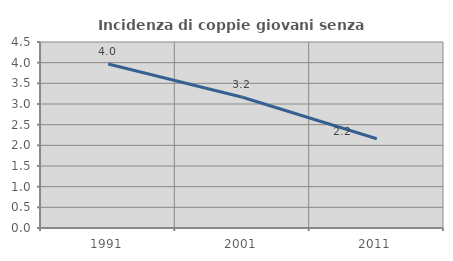
| Category | Incidenza di coppie giovani senza figli |
|---|---|
| 1991.0 | 3.967 |
| 2001.0 | 3.165 |
| 2011.0 | 2.16 |